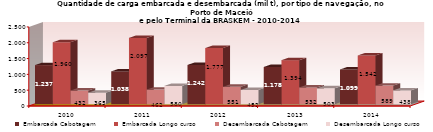
| Category | Embarcada Cabotagem | Embarcada Longo curso | Desembarcada Cabotagem | Desembarcada Longo curso |
|---|---|---|---|---|
| 2010.0 | 1237386 | 1959682 | 431914 | 365010 |
| 2011.0 | 1038099 | 2096889 | 462162 | 579975 |
| 2012.0 | 1242118 | 1776589 | 550570 | 451662 |
| 2013.0 | 1177847 | 1393587 | 531531 | 502556 |
| 2014.0 | 1098704 | 1541938 | 589370 | 438078 |